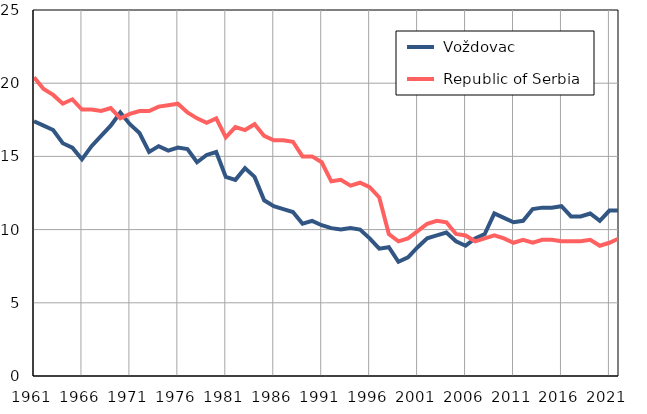
| Category |  Voždovac |  Republic of Serbia |
|---|---|---|
| 1961.0 | 17.4 | 20.4 |
| 1962.0 | 17.1 | 19.6 |
| 1963.0 | 16.8 | 19.2 |
| 1964.0 | 15.9 | 18.6 |
| 1965.0 | 15.6 | 18.9 |
| 1966.0 | 14.8 | 18.2 |
| 1967.0 | 15.7 | 18.2 |
| 1968.0 | 16.4 | 18.1 |
| 1969.0 | 17.1 | 18.3 |
| 1970.0 | 18 | 17.6 |
| 1971.0 | 17.2 | 17.9 |
| 1972.0 | 16.6 | 18.1 |
| 1973.0 | 15.3 | 18.1 |
| 1974.0 | 15.7 | 18.4 |
| 1975.0 | 15.4 | 18.5 |
| 1976.0 | 15.6 | 18.6 |
| 1977.0 | 15.5 | 18 |
| 1978.0 | 14.6 | 17.6 |
| 1979.0 | 15.1 | 17.3 |
| 1980.0 | 15.3 | 17.6 |
| 1981.0 | 13.6 | 16.3 |
| 1982.0 | 13.4 | 17 |
| 1983.0 | 14.2 | 16.8 |
| 1984.0 | 13.6 | 17.2 |
| 1985.0 | 12 | 16.4 |
| 1986.0 | 11.6 | 16.1 |
| 1987.0 | 11.4 | 16.1 |
| 1988.0 | 11.2 | 16 |
| 1989.0 | 10.4 | 15 |
| 1990.0 | 10.6 | 15 |
| 1991.0 | 10.3 | 14.6 |
| 1992.0 | 10.1 | 13.3 |
| 1993.0 | 10 | 13.4 |
| 1994.0 | 10.1 | 13 |
| 1995.0 | 10 | 13.2 |
| 1996.0 | 9.4 | 12.9 |
| 1997.0 | 8.7 | 12.2 |
| 1998.0 | 8.8 | 9.7 |
| 1999.0 | 7.8 | 9.2 |
| 2000.0 | 8.1 | 9.4 |
| 2001.0 | 8.8 | 9.9 |
| 2002.0 | 9.4 | 10.4 |
| 2003.0 | 9.6 | 10.6 |
| 2004.0 | 9.8 | 10.5 |
| 2005.0 | 9.2 | 9.7 |
| 2006.0 | 8.9 | 9.6 |
| 2007.0 | 9.4 | 9.2 |
| 2008.0 | 9.7 | 9.4 |
| 2009.0 | 11.1 | 9.6 |
| 2010.0 | 10.8 | 9.4 |
| 2011.0 | 10.5 | 9.1 |
| 2012.0 | 10.6 | 9.3 |
| 2013.0 | 11.4 | 9.1 |
| 2014.0 | 11.5 | 9.3 |
| 2015.0 | 11.5 | 9.3 |
| 2016.0 | 11.6 | 9.2 |
| 2017.0 | 10.9 | 9.2 |
| 2018.0 | 10.9 | 9.2 |
| 2019.0 | 11.1 | 9.3 |
| 2020.0 | 10.6 | 8.9 |
| 2021.0 | 11.3 | 9.1 |
| 2022.0 | 11.3 | 9.4 |